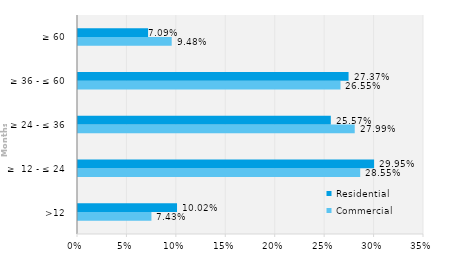
| Category | Commercial | Residential |
|---|---|---|
| >12 | 0.074 | 0.1 |
| ≥  12 - ≤ 24 | 0.285 | 0.3 |
| ≥ 24 - ≤ 36 | 0.28 | 0.256 |
| ≥ 36 - ≤ 60 | 0.266 | 0.274 |
| ≥ 60 | 0.095 | 0.071 |